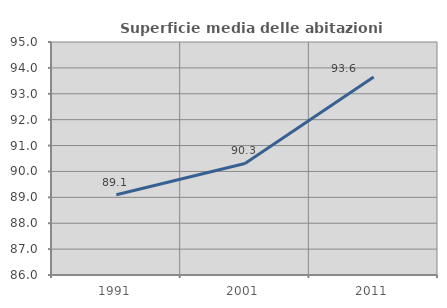
| Category | Superficie media delle abitazioni occupate |
|---|---|
| 1991.0 | 89.098 |
| 2001.0 | 90.308 |
| 2011.0 | 93.65 |